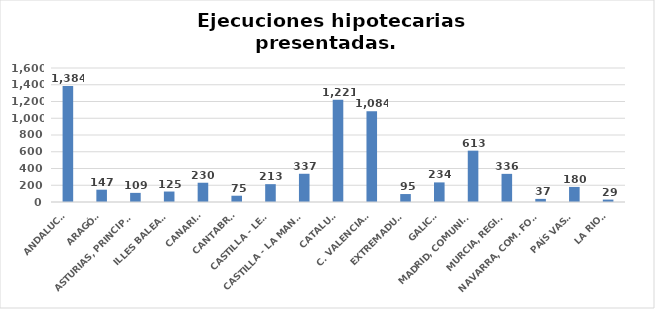
| Category | Series 0 |
|---|---|
| ANDALUCÍA | 1384 |
| ARAGÓN | 147 |
| ASTURIAS, PRINCIPADO | 109 |
| ILLES BALEARS | 125 |
| CANARIAS | 230 |
| CANTABRIA | 75 |
| CASTILLA - LEÓN | 213 |
| CASTILLA - LA MANCHA | 337 |
| CATALUÑA | 1221 |
| C. VALENCIANA | 1084 |
| EXTREMADURA | 95 |
| GALICIA | 234 |
| MADRID, COMUNIDAD | 613 |
| MURCIA, REGIÓN | 336 |
| NAVARRA, COM. FORAL | 37 |
| PAÍS VASCO | 180 |
| LA RIOJA | 29 |